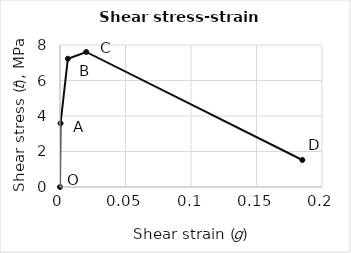
| Category | Series 0 |
|---|---|
| 0.0 | 0 |
| 0.00043 | 3.586 |
| 0.006 | 7.227 |
| 0.02 | 7.607 |
| 0.185 | 1.521 |